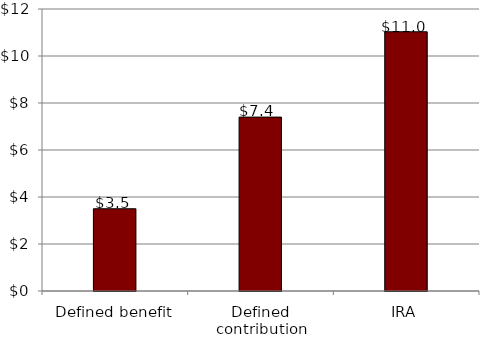
| Category | Series 0 |
|---|---|
| Defined benefit | 3.5 |
| Defined contribution | 7.4 |
| IRA | 11.03 |